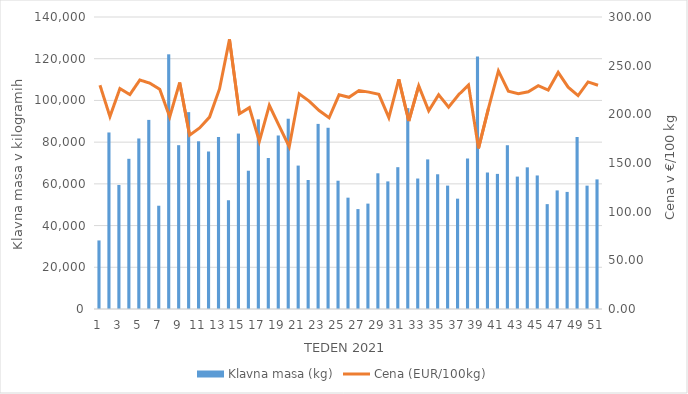
| Category | Klavna masa (kg) |
|---|---|
| 1.0 | 32871 |
| 2.0 | 84639 |
| 3.0 | 59476 |
| 4.0 | 72013 |
| 5.0 | 81759 |
| 6.0 | 90669 |
| 7.0 | 49517 |
| 8.0 | 122111 |
| 9.0 | 78545 |
| 10.0 | 94384 |
| 11.0 | 80405 |
| 12.0 | 75534 |
| 13.0 | 82440 |
| 14.0 | 52143 |
| 15.0 | 84105 |
| 16.0 | 66298 |
| 17.0 | 90925 |
| 18.0 | 72394 |
| 19.0 | 83193 |
| 20.0 | 91231 |
| 21.0 | 68763 |
| 22.0 | 61837 |
| 23.0 | 88747 |
| 24.0 | 86888 |
| 25.0 | 61507 |
| 26.0 | 53379 |
| 27.0 | 47910 |
| 28.0 | 50529 |
| 29.0 | 65062 |
| 30.0 | 61178 |
| 31.0 | 67992 |
| 32.0 | 96308 |
| 33.0 | 62558 |
| 34.0 | 71729 |
| 35.0 | 64596 |
| 36.0 | 59160 |
| 37.0 | 52905 |
| 38.0 | 72159 |
| 39.0 | 121060 |
| 40.0 | 65445 |
| 41.0 | 64780 |
| 42.0 | 78522 |
| 43.0 | 63486 |
| 44.0 | 67920 |
| 45.0 | 64023 |
| 46.0 | 50280 |
| 47.0 | 56852 |
| 48.0 | 56136 |
| 49.0 | 82462 |
| 50.0 | 59140 |
| 51.0 | 62144 |